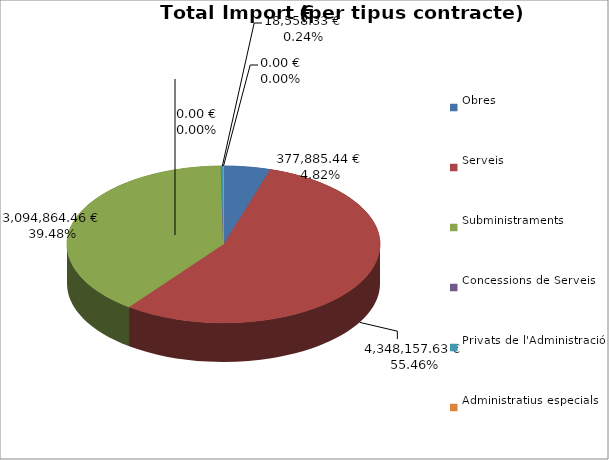
| Category | Total preu
(amb IVA) |
|---|---|
| Obres | 377885.44 |
| Serveis | 4348157.63 |
| Subministraments | 3094864.46 |
| Concessions de Serveis | 0 |
| Privats de l'Administració | 18558.33 |
| Administratius especials | 0 |